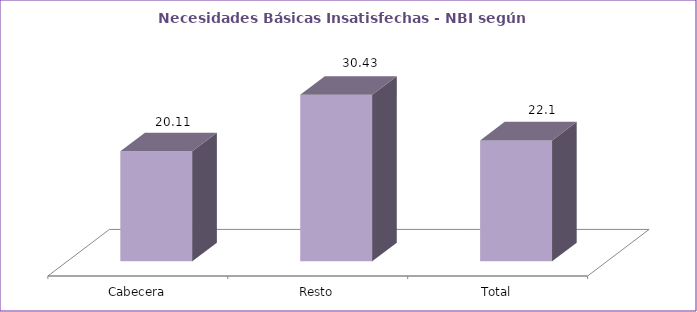
| Category | Series 0 |
|---|---|
| Cabecera | 20.11 |
| Resto | 30.43 |
| Total | 22.1 |